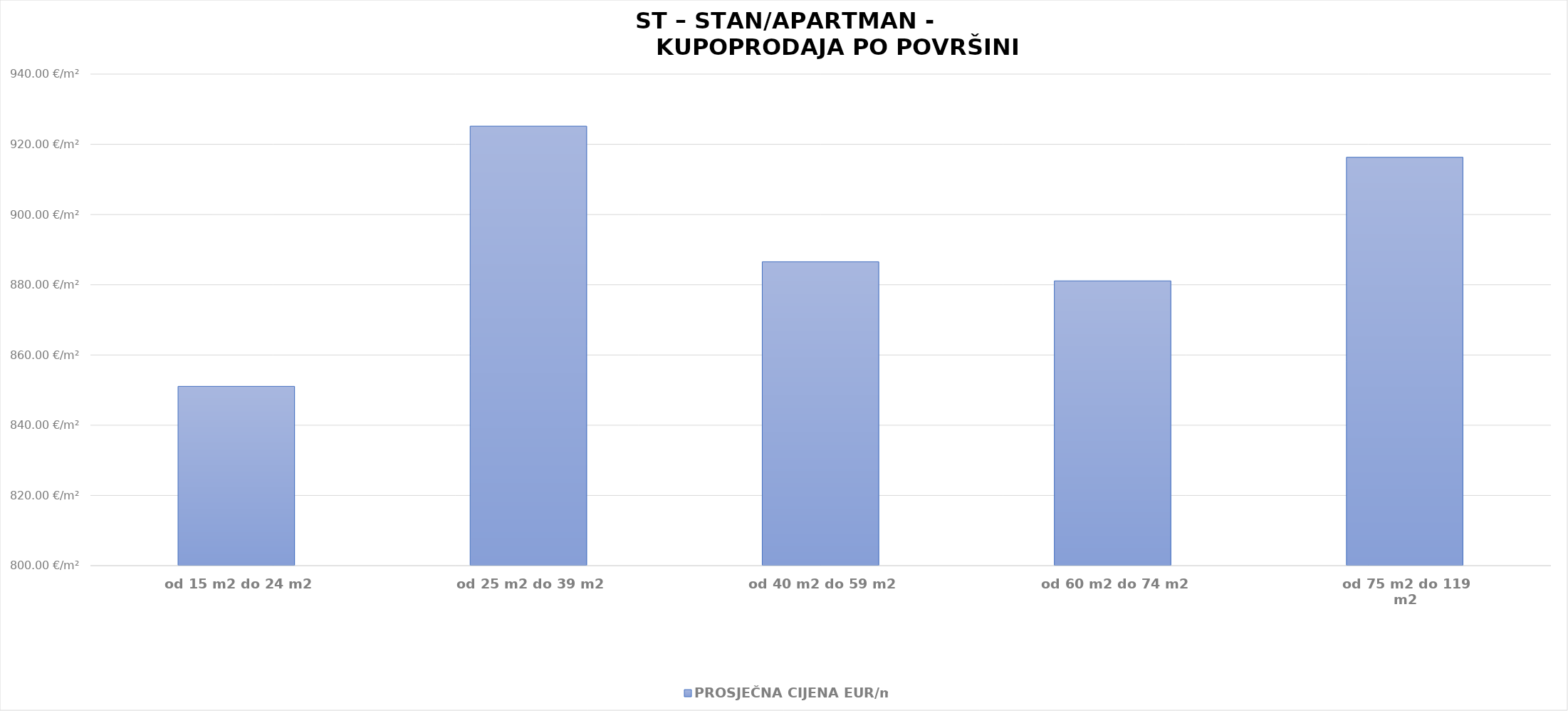
| Category | PROSJEČNA CIJENA EUR/m2 |
|---|---|
| od 15 m2 do 24 m2 | 1902-04-30 01:31:54 |
| od 25 m2 do 39 m2 | 1902-07-13 04:00:00 |
| od 40 m2 do 59 m2 | 1902-06-04 13:06:20 |
| od 60 m2 do 74 m2 | 1902-05-30 02:36:52 |
| od 75 m2 do 119 m2 | 1902-07-04 07:19:10 |